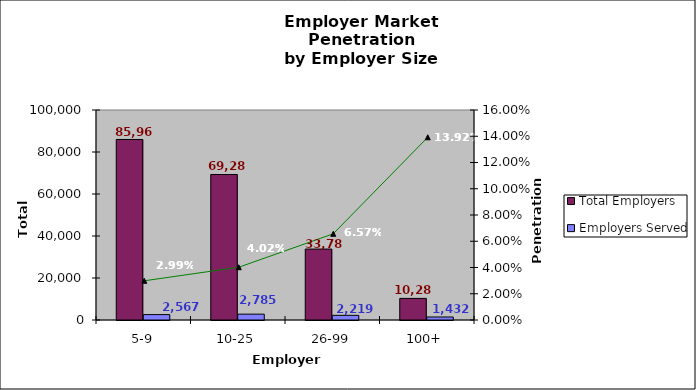
| Category | Total Employers | Employers Served |
|---|---|---|
| 5-9 | 85963 | 2567 |
| 10-25 | 69287 | 2785 |
| 26-99 | 33781 | 2219 |
| 100+ | 10287 | 1432 |